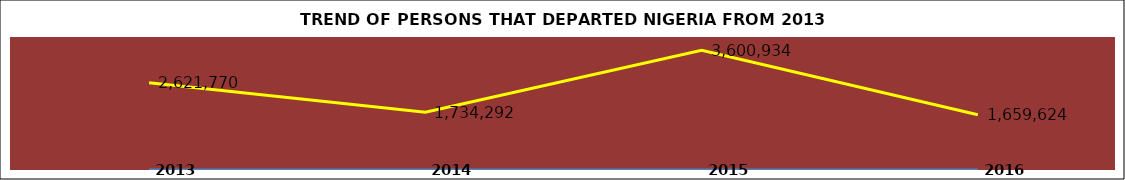
| Category | Series 0 | Series 1 |
|---|---|---|
| 0 | 2013 | 2621770 |
| 1 | 2014 | 1734292 |
| 2 | 2015 | 3600934 |
| 3 | 2016 | 1659624 |